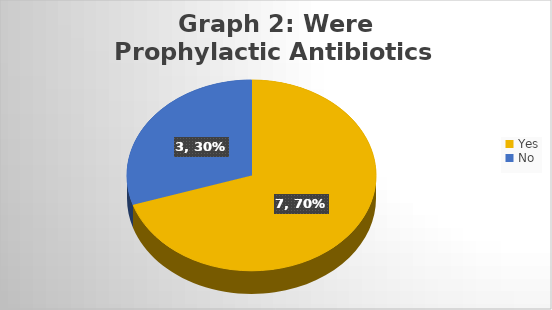
| Category | Series 0 |
|---|---|
| Yes  | 7 |
| No | 3 |